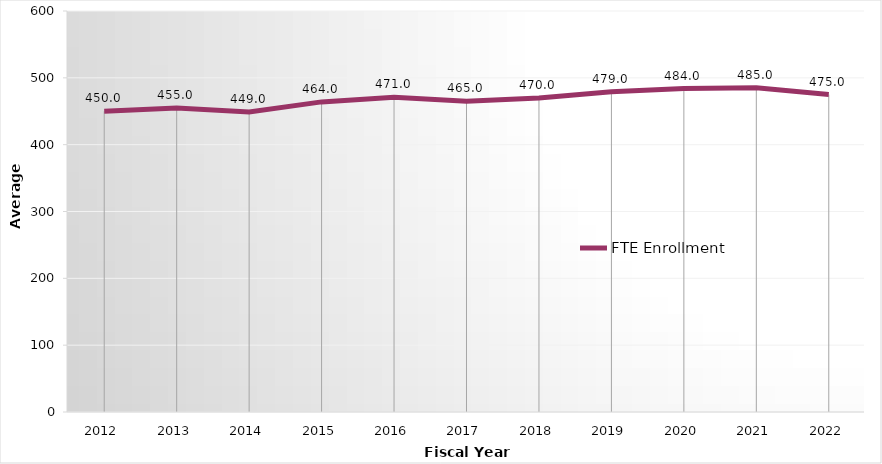
| Category | FTE Enrollment |
|---|---|
| 2012.0 | 450 |
| 2013.0 | 455 |
| 2014.0 | 449 |
| 2015.0 | 464 |
| 2016.0 | 471 |
| 2017.0 | 465 |
| 2018.0 | 470 |
| 2019.0 | 479 |
| 2020.0 | 484 |
| 2021.0 | 485 |
| 2022.0 | 475 |